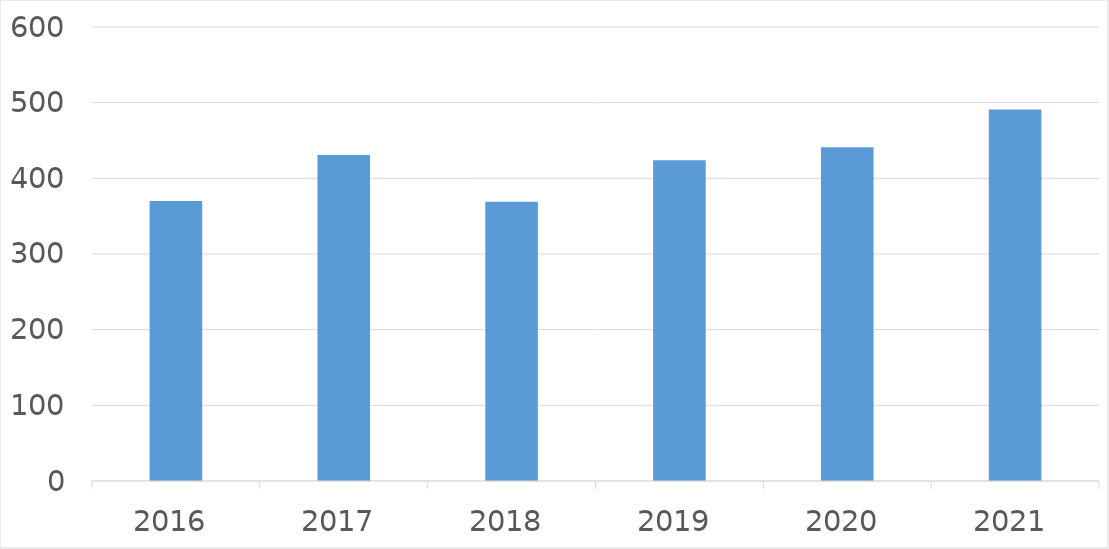
| Category | Series 0 |
|---|---|
| 2016 | 370 |
| 2017 | 431 |
| 2018 | 369 |
| 2019 | 424 |
| 2020 | 441 |
| 2021 | 491 |